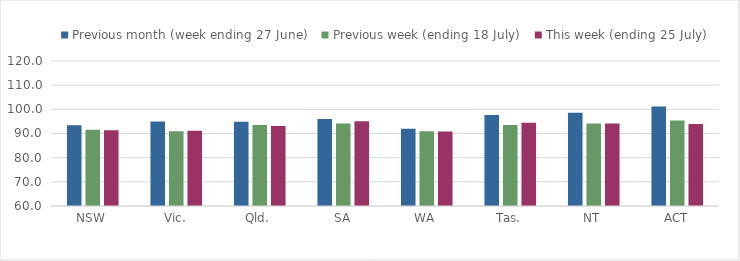
| Category | Previous month (week ending 27 June) | Previous week (ending 18 July) | This week (ending 25 July) |
|---|---|---|---|
| NSW | 93.391 | 91.504 | 91.298 |
| Vic. | 94.957 | 90.957 | 91.187 |
| Qld. | 94.902 | 93.544 | 93.135 |
| SA | 96.014 | 94.183 | 95.023 |
| WA | 91.956 | 90.887 | 90.813 |
| Tas. | 97.645 | 93.489 | 94.421 |
| NT | 98.618 | 94.167 | 94.167 |
| ACT | 101.177 | 95.389 | 93.947 |